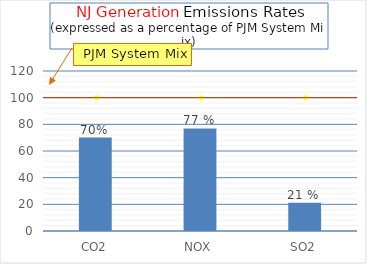
| Category | NJ Generation (%)  |
|---|---|
| CO2 | 70.076 |
| NOX | 76.923 |
| SO2 | 21.277 |